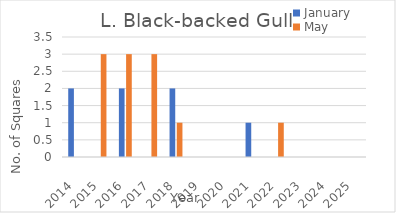
| Category | January | May |
|---|---|---|
| 2014.0 | 2 | 0 |
| 2015.0 | 0 | 3 |
| 2016.0 | 2 | 3 |
| 2017.0 | 0 | 3 |
| 2018.0 | 2 | 1 |
| 2019.0 | 0 | 0 |
| 2020.0 | 0 | 0 |
| 2021.0 | 1 | 0 |
| 2022.0 | 0 | 1 |
| 2023.0 | 0 | 0 |
| 2024.0 | 0 | 0 |
| 2025.0 | 0 | 0 |